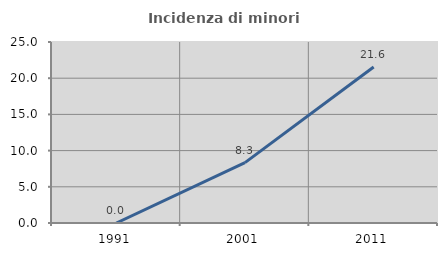
| Category | Incidenza di minori stranieri |
|---|---|
| 1991.0 | 0 |
| 2001.0 | 8.333 |
| 2011.0 | 21.557 |